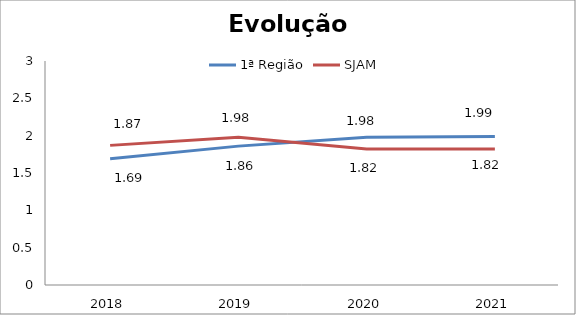
| Category | 1ª Região | SJAM |
|---|---|---|
| 0 | 1.69 | 1.87 |
| 1 | 1.86 | 1.98 |
| 2 | 1.98 | 1.82 |
| 3 | 1.99 | 1.82 |